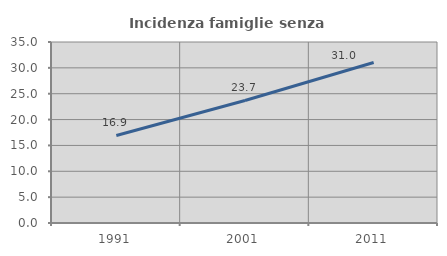
| Category | Incidenza famiglie senza nuclei |
|---|---|
| 1991.0 | 16.93 |
| 2001.0 | 23.697 |
| 2011.0 | 31.048 |